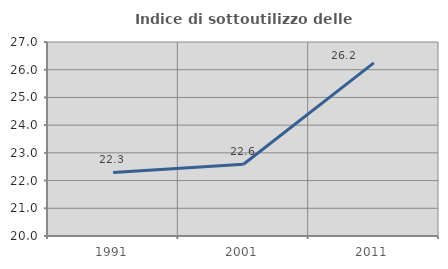
| Category | Indice di sottoutilizzo delle abitazioni  |
|---|---|
| 1991.0 | 22.292 |
| 2001.0 | 22.587 |
| 2011.0 | 26.245 |